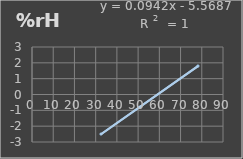
| Category | Humedad |
|---|---|
| 32.5 | -2.5 |
| 50.8 | -0.8 |
| 78.2 | 1.8 |